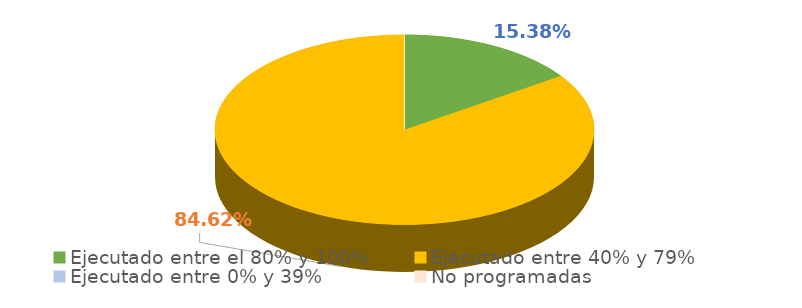
| Category | Series 0 |
|---|---|
| Ejecutado entre el 80% y 100% | 0.154 |
| Ejecutado entre 40% y 79% | 0.846 |
| Ejecutado entre 0% y 39% | 0 |
| No programadas | 0 |